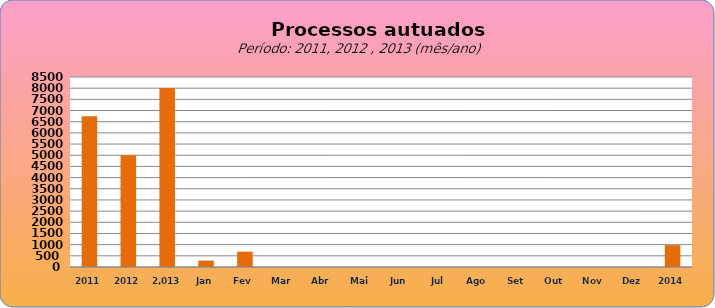
| Category | 6749 4998  8.003   288  688 0 0 0 0 0 0 0 0 0 0 |
|---|---|
| 2011 | 6749 |
| 2012 | 4998 |
|  2.013  | 8003 |
| Jan | 288 |
| Fev | 688 |
| Mar | 0 |
| Abr | 0 |
| Mai | 0 |
| Jun | 0 |
| Jul | 0 |
| Ago | 0 |
| Set | 0 |
| Out | 0 |
| Nov | 0 |
| Dez | 0 |
| 2014 | 976 |